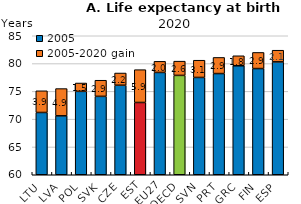
| Category | 2005 | 2005-2020 gain |
|---|---|---|
| LTU | 71.2 | 3.9 |
| LVA | 70.6 | 4.9 |
| POL | 75 | 1.5 |
| SVK | 74.1 | 2.9 |
| CZE | 76.1 | 2.2 |
| EST | 73 | 5.9 |
| EU27 | 78.4 | 2 |
| OECD | 77.87 | 2.562 |
| SVN | 77.5 | 3.1 |
| PRT | 78.2 | 2.9 |
| GRC | 79.6 | 1.8 |
| FIN | 79.1 | 2.9 |
| ESP | 80.3 | 2.1 |